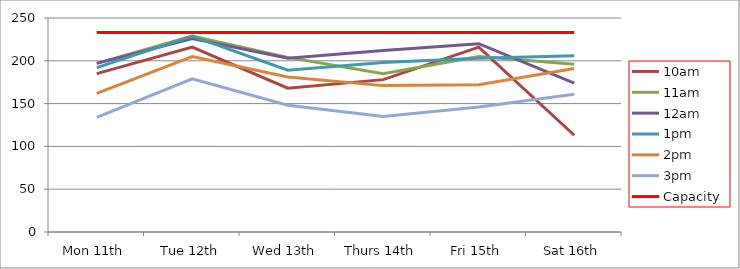
| Category | 9am | 10am | 11am | 12am | 1pm | 2pm | 3pm | 4pm | 5pm | Capacity |
|---|---|---|---|---|---|---|---|---|---|---|
| Mon 11th |  | 185 | 197 | 197 | 192 | 162 | 134 |  |  | 233 |
| Tue 12th |  | 216 | 229 | 226 | 229 | 205 | 179 |  |  | 233 |
| Wed 13th |  | 168 | 204 | 203 | 189 | 181 | 148 |  |  | 233 |
| Thurs 14th |  | 178 | 185 | 212 | 198 | 171 | 135 |  |  | 233 |
| Fri 15th |  | 216 | 205 | 220 | 203 | 172 | 146 |  |  | 233 |
| Sat 16th |  | 113 | 196 | 174 | 206 | 191 | 161 |  |  | 233 |